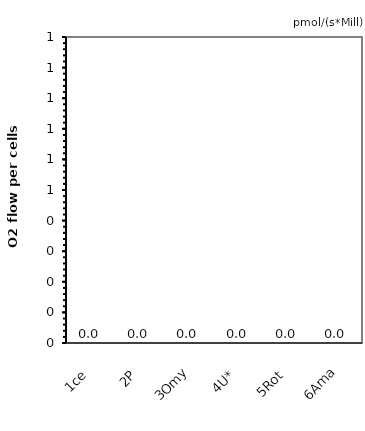
| Category | pmol/(s*Mill) |
|---|---|
| 1ce | 0 |
| 2P | 0 |
| 3Omy | 0 |
| 4U* | 0 |
| 5Rot | 0 |
| 6Ama | 0 |